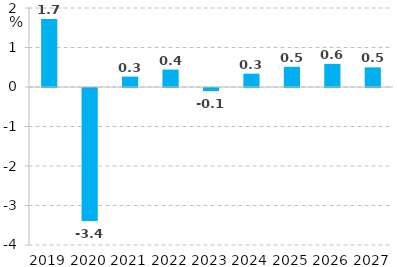
| Category | RRZ |
|---|---|
| 2019.0 | 1.723 |
| 2020.0 | -3.364 |
| 2021.0 | 0.263 |
| 2022.0 | 0.441 |
| 2023.0 | -0.079 |
| 2024.0 | 0.337 |
| 2025.0 | 0.511 |
| 2026.0 | 0.585 |
| 2027.0 | 0.498 |